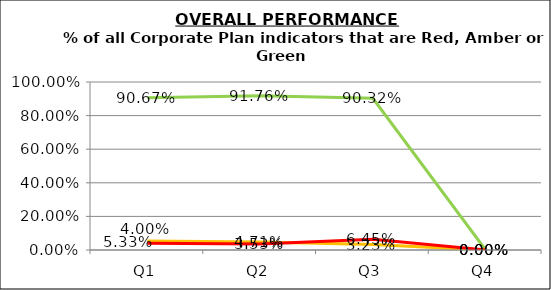
| Category | Green | Amber | Red |
|---|---|---|---|
| Q1 | 0.907 | 0.053 | 0.04 |
| Q2 | 0.918 | 0.047 | 0.035 |
| Q3 | 0.903 | 0.032 | 0.065 |
| Q4 | 0 | 0 | 0 |